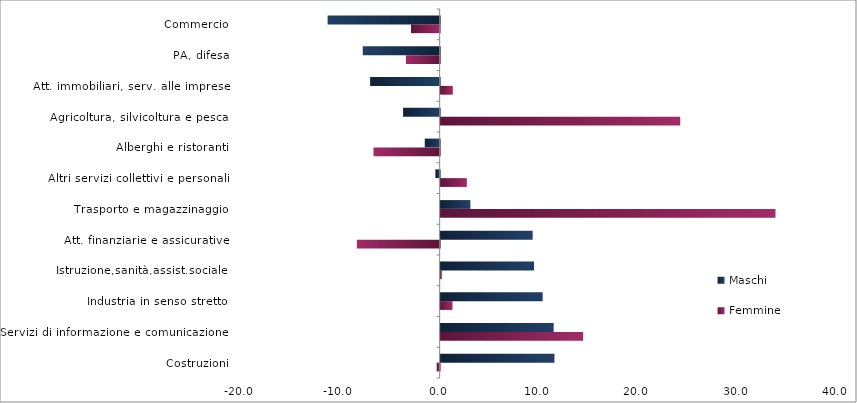
| Category | Maschi | Femmine |
|---|---|---|
| Commercio | -11.277 | -2.884 |
| PA, difesa | -7.739 | -3.399 |
| Att. immobiliari, serv. alle imprese | -7.001 | 1.223 |
| Agricoltura, silvicoltura e pesca | -3.683 | 24.116 |
| Alberghi e ristoranti | -1.503 | -6.655 |
| Altri servizi collettivi e personali | -0.432 | 2.632 |
| Trasporto e magazzinaggio | 2.988 | 33.697 |
| Att. finanziarie e assicurative | 9.261 | -8.336 |
| Istruzione,sanità,assist.sociale | 9.398 | 0.104 |
| Industria in senso stretto | 10.268 | 1.182 |
| Servizi di informazione e comunicazione | 11.375 | 14.34 |
| Costruzioni | 11.451 | -0.308 |